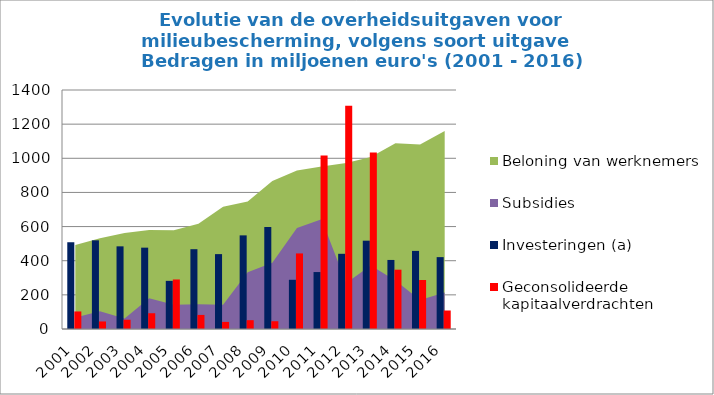
| Category | Investeringen (a) | Geconsolideerde kapitaalverdrachten |
|---|---|---|
| 2001.0 | 508.2 | 102.8 |
| 2002.0 | 519.4 | 44.2 |
| 2003.0 | 484.2 | 54.3 |
| 2004.0 | 476.5 | 92.4 |
| 2005.0 | 282 | 290.1 |
| 2006.0 | 467.5 | 82.5 |
| 2007.0 | 438.7 | 41.5 |
| 2008.0 | 548.5 | 51.7 |
| 2009.0 | 597.4 | 45.6 |
| 2010.0 | 288.3 | 442.7 |
| 2011.0 | 333.6 | 1015.9 |
| 2012.0 | 440.5 | 1307.6 |
| 2013.0 | 517.4 | 1034.1 |
| 2014.0 | 404.5 | 347.4 |
| 2015.0 | 457.5 | 286.9 |
| 2016.0 | 421 | 108.4 |